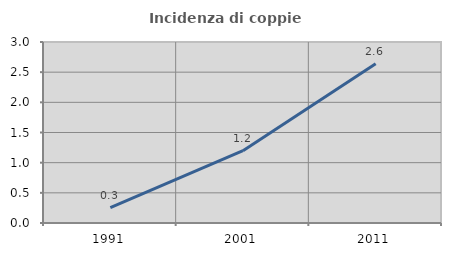
| Category | Incidenza di coppie miste |
|---|---|
| 1991.0 | 0.255 |
| 2001.0 | 1.199 |
| 2011.0 | 2.64 |